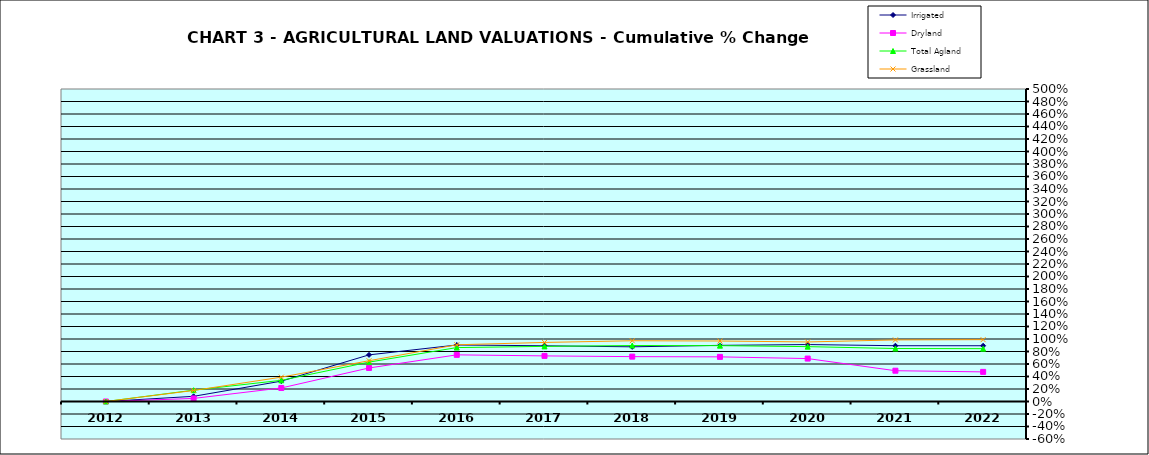
| Category | Irrigated | Dryland | Total Agland | Grassland |
|---|---|---|---|---|
| 2012.0 | 0 | 0 | 0 | 0 |
| 2013.0 | 0.083 | 0.049 | 0.181 | 0.176 |
| 2014.0 | 0.326 | 0.217 | 0.339 | 0.389 |
| 2015.0 | 0.746 | 0.537 | 0.63 | 0.652 |
| 2016.0 | 0.904 | 0.746 | 0.863 | 0.908 |
| 2017.0 | 0.892 | 0.73 | 0.882 | 0.945 |
| 2018.0 | 0.875 | 0.718 | 0.896 | 0.972 |
| 2019.0 | 0.898 | 0.714 | 0.894 | 0.968 |
| 2020.0 | 0.911 | 0.687 | 0.878 | 0.953 |
| 2021.0 | 0.892 | 0.493 | 0.848 | 0.985 |
| 2022.0 | 0.892 | 0.474 | 0.845 | 0.99 |